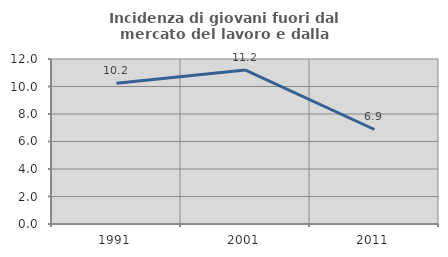
| Category | Incidenza di giovani fuori dal mercato del lavoro e dalla formazione  |
|---|---|
| 1991.0 | 10.244 |
| 2001.0 | 11.194 |
| 2011.0 | 6.873 |